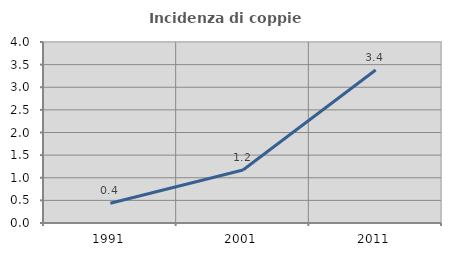
| Category | Incidenza di coppie miste |
|---|---|
| 1991.0 | 0.436 |
| 2001.0 | 1.171 |
| 2011.0 | 3.381 |